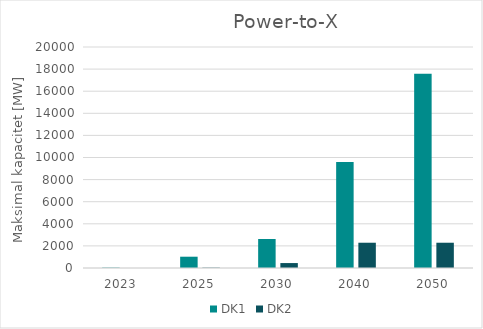
| Category | DK1 | DK2 |
|---|---|---|
| 2023.0 | 32 | 0 |
| 2025.0 | 1022 | 30 |
| 2030.0 | 2625.5 | 447 |
| 2040.0 | 9587 | 2287 |
| 2050.0 | 17587 | 2287 |